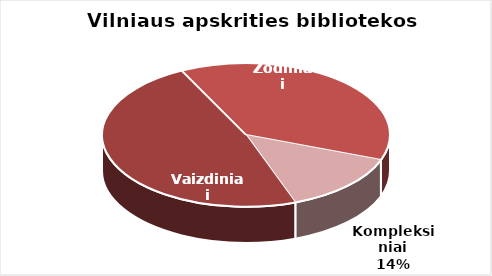
| Category | Series 0 |
|---|---|
| Vaizdiniai | 3814 |
| Žodiniai | 3013 |
| Kompleksiniai | 1089 |